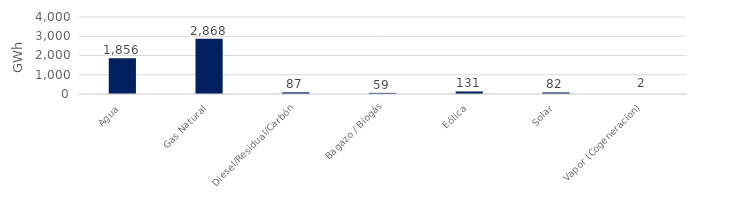
| Category | Series 0 |
|---|---|
| Agua | 1856.41 |
| Gas Natural | 2868.06 |
| Diesel/Residual/Carbón | 86.743 |
| Bagazo / Biogás | 58.616 |
| Eólica | 131.262 |
| Solar | 81.91 |
| Vapor (Cogeneracion) | 1.567 |